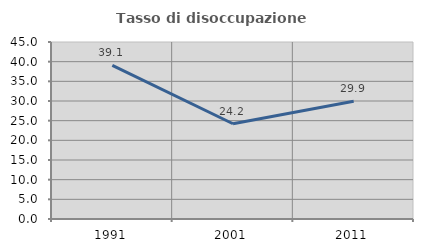
| Category | Tasso di disoccupazione giovanile  |
|---|---|
| 1991.0 | 39.078 |
| 2001.0 | 24.212 |
| 2011.0 | 29.913 |